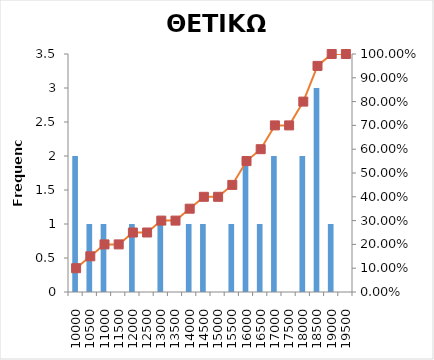
| Category | Series 0 |
|---|---|
| 10000 | 2 |
| 10500 | 1 |
| 11000 | 1 |
| 11500 | 0 |
| 12000 | 1 |
| 12500 | 0 |
| 13000 | 1 |
| 13500 | 0 |
| 14000 | 1 |
| 14500 | 1 |
| 15000 | 0 |
| 15500 | 1 |
| 16000 | 2 |
| 16500 | 1 |
| 17000 | 2 |
| 17500 | 0 |
| 18000 | 2 |
| 18500 | 3 |
| 19000 | 1 |
| 19500 | 0 |